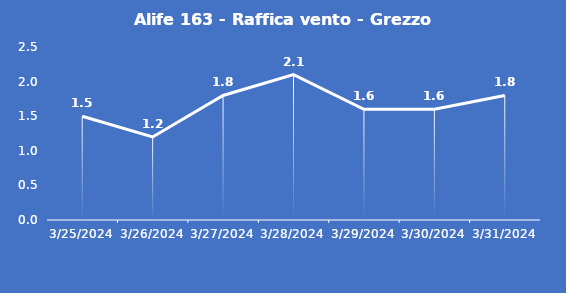
| Category | Alife 163 - Raffica vento - Grezzo (m/s) |
|---|---|
| 3/25/24 | 1.5 |
| 3/26/24 | 1.2 |
| 3/27/24 | 1.8 |
| 3/28/24 | 2.1 |
| 3/29/24 | 1.6 |
| 3/30/24 | 1.6 |
| 3/31/24 | 1.8 |